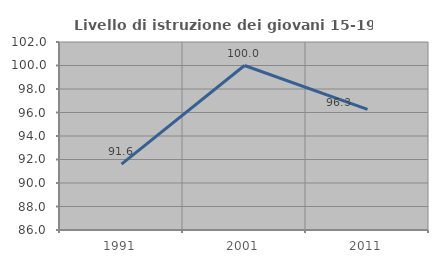
| Category | Livello di istruzione dei giovani 15-19 anni |
|---|---|
| 1991.0 | 91.613 |
| 2001.0 | 100 |
| 2011.0 | 96.262 |